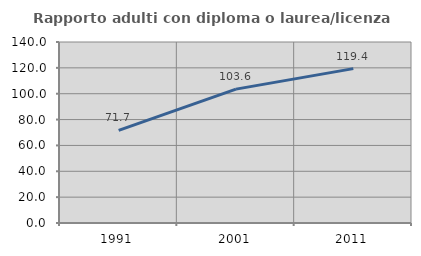
| Category | Rapporto adulti con diploma o laurea/licenza media  |
|---|---|
| 1991.0 | 71.667 |
| 2001.0 | 103.561 |
| 2011.0 | 119.415 |